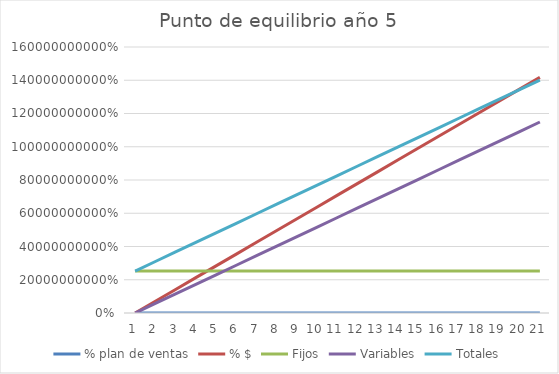
| Category | % plan de ventas | % $ | Fijos | Variables | Totales |
|---|---|---|---|---|---|
| 0 | 0 | 0 | 252252233.877 | 0 | 252252233.877 |
| 1 | 0.05 | 70875000 | 252252233.877 | 57447214.835 | 309699448.712 |
| 2 | 0.1 | 141750000 | 252252233.877 | 114894429.671 | 367146663.548 |
| 3 | 0.15 | 212625000 | 252252233.877 | 172341644.506 | 424593878.383 |
| 4 | 0.2 | 283500000 | 252252233.877 | 229788859.342 | 482041093.219 |
| 5 | 0.25 | 354375000 | 252252233.877 | 287236074.177 | 539488308.054 |
| 6 | 0.3 | 425250000 | 252252233.877 | 344683289.013 | 596935522.89 |
| 7 | 0.35 | 496125000 | 252252233.877 | 402130503.848 | 654382737.725 |
| 8 | 0.4 | 567000000 | 252252233.877 | 459577718.684 | 711829952.561 |
| 9 | 0.45 | 637875000 | 252252233.877 | 517024933.519 | 769277167.396 |
| 10 | 0.5 | 708750000 | 252252233.877 | 574472148.355 | 826724382.231 |
| 11 | 0.55 | 779625000 | 252252233.877 | 631919363.19 | 884171597.067 |
| 12 | 0.6 | 850500000 | 252252233.877 | 689366578.026 | 941618811.902 |
| 13 | 0.65 | 921375000 | 252252233.877 | 746813792.861 | 999066026.738 |
| 14 | 0.7 | 992250000 | 252252233.877 | 804261007.697 | 1056513241.573 |
| 15 | 0.75 | 1063125000 | 252252233.877 | 861708222.532 | 1113960456.409 |
| 16 | 0.8 | 1134000000 | 252252233.877 | 919155437.368 | 1171407671.244 |
| 17 | 0.85 | 1204875000 | 252252233.877 | 976602652.203 | 1228854886.08 |
| 18 | 0.9 | 1275750000 | 252252233.877 | 1034049867.039 | 1286302100.915 |
| 19 | 0.95 | 1346625000 | 252252233.877 | 1091497081.874 | 1343749315.751 |
| 20 | 1 | 1417500000 | 252252233.877 | 1148944296.709 | 1401196530.586 |